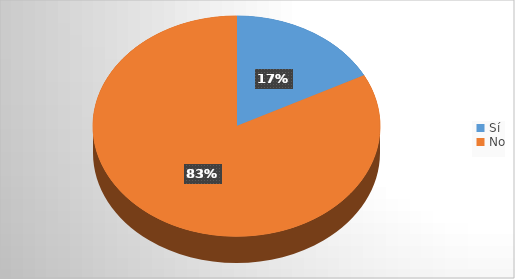
| Category | Series 0 |
|---|---|
| Sí | 233 |
| No | 1108 |